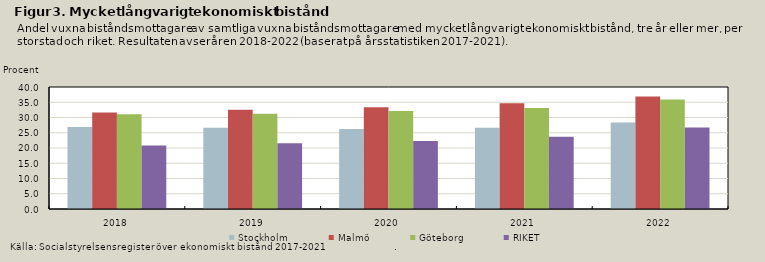
| Category | Stockholm | Malmö | Göteborg | RIKET |
|---|---|---|---|---|
| 2018.0 | 26.918 | 31.62 | 31.026 | 20.826 |
| 2019.0 | 26.621 | 32.557 | 31.216 | 21.574 |
| 2020.0 | 26.196 | 33.32 | 32.131 | 22.317 |
| 2021.0 | 26.65 | 34.677 | 33.117 | 23.674 |
| 2022.0 | 28.327 | 36.895 | 35.905 | 26.721 |